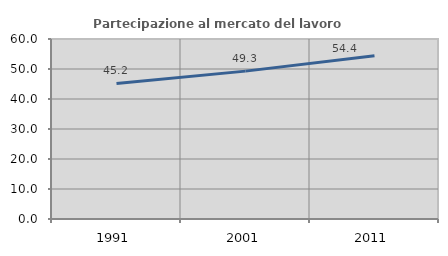
| Category | Partecipazione al mercato del lavoro  femminile |
|---|---|
| 1991.0 | 45.193 |
| 2001.0 | 49.291 |
| 2011.0 | 54.444 |